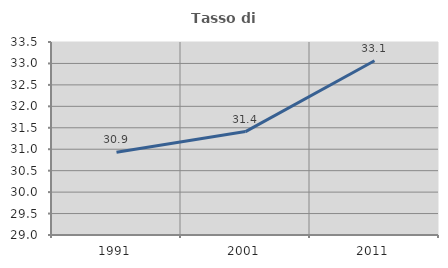
| Category | Tasso di occupazione   |
|---|---|
| 1991.0 | 30.93 |
| 2001.0 | 31.411 |
| 2011.0 | 33.064 |